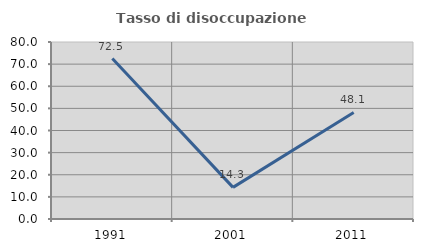
| Category | Tasso di disoccupazione giovanile  |
|---|---|
| 1991.0 | 72.5 |
| 2001.0 | 14.286 |
| 2011.0 | 48.148 |